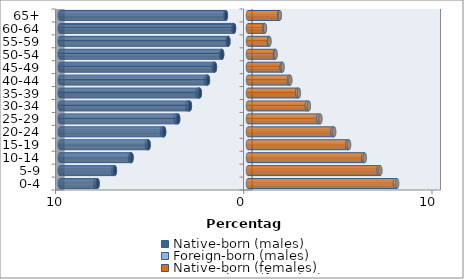
| Category | Native-born (males) | Foreign-born (males) | Native-born (females) | Foreign-born (females) |
|---|---|---|---|---|
| 0-4 | -7.991 | -0.124 | 7.807 | 0.114 |
| 5-9 | -7.072 | -0.092 | 6.94 | 0.09 |
| 10-14 | -6.188 | -0.084 | 6.12 | 0.083 |
| 15-19 | -5.28 | -0.097 | 5.276 | 0.092 |
| 20-24 | -4.456 | -0.11 | 4.483 | 0.096 |
| 25-29 | -3.711 | -0.137 | 3.737 | 0.11 |
| 30-34 | -3.087 | -0.144 | 3.128 | 0.105 |
| 35-39 | -2.558 | -0.13 | 2.616 | 0.088 |
| 40-44 | -2.129 | -0.111 | 2.178 | 0.071 |
| 45-49 | -1.757 | -0.081 | 1.792 | 0.048 |
| 50-54 | -1.377 | -0.059 | 1.432 | 0.034 |
| 55-59 | -1.042 | -0.044 | 1.114 | 0.026 |
| 60-64 | -0.743 | -0.032 | 0.877 | 0.021 |
| 65+ | -1.175 | -0.023 | 1.668 | 0.02 |